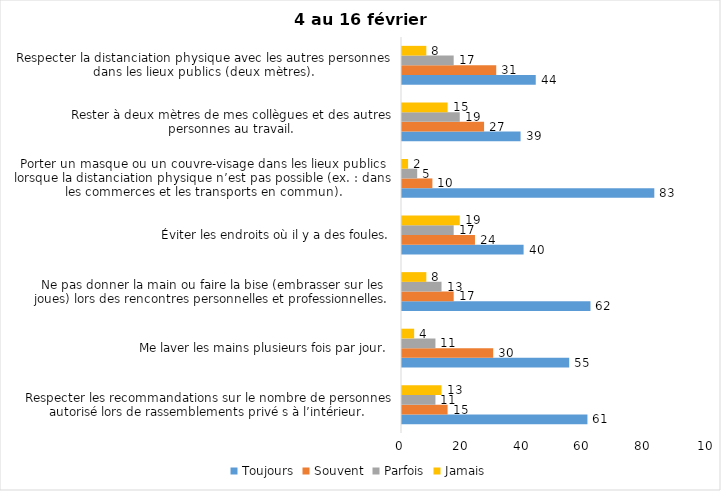
| Category | Toujours | Souvent | Parfois | Jamais |
|---|---|---|---|---|
| Respecter les recommandations sur le nombre de personnes autorisé lors de rassemblements privé s à l’intérieur. | 61 | 15 | 11 | 13 |
| Me laver les mains plusieurs fois par jour. | 55 | 30 | 11 | 4 |
| Ne pas donner la main ou faire la bise (embrasser sur les joues) lors des rencontres personnelles et professionnelles. | 62 | 17 | 13 | 8 |
| Éviter les endroits où il y a des foules. | 40 | 24 | 17 | 19 |
| Porter un masque ou un couvre-visage dans les lieux publics lorsque la distanciation physique n’est pas possible (ex. : dans les commerces et les transports en commun). | 83 | 10 | 5 | 2 |
| Rester à deux mètres de mes collègues et des autres personnes au travail. | 39 | 27 | 19 | 15 |
| Respecter la distanciation physique avec les autres personnes dans les lieux publics (deux mètres). | 44 | 31 | 17 | 8 |